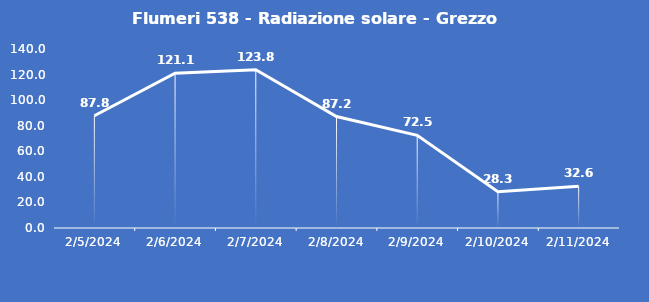
| Category | Flumeri 538 - Radiazione solare - Grezzo (W/m2) |
|---|---|
| 2/5/24 | 87.8 |
| 2/6/24 | 121.1 |
| 2/7/24 | 123.8 |
| 2/8/24 | 87.2 |
| 2/9/24 | 72.5 |
| 2/10/24 | 28.3 |
| 2/11/24 | 32.6 |